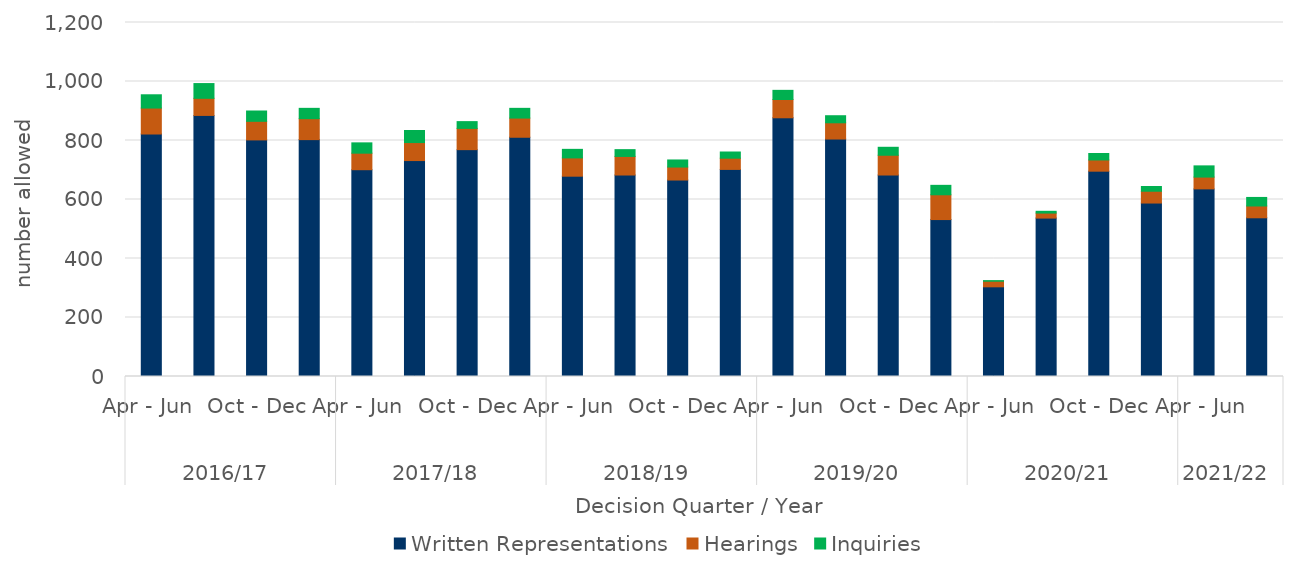
| Category | Written Representations | Hearings | Inquiries |
|---|---|---|---|
| 0 | 822 | 88 | 45 |
| 1 | 885 | 58 | 50 |
| 2 | 802 | 63 | 35 |
| 3 | 803 | 71 | 35 |
| 4 | 701 | 56 | 35 |
| 5 | 732 | 61 | 41 |
| 6 | 769 | 72 | 23 |
| 7 | 811 | 65 | 33 |
| 8 | 679 | 62 | 29 |
| 9 | 683 | 63 | 23 |
| 10 | 666 | 44 | 24 |
| 11 | 702 | 38 | 21 |
| 12 | 877 | 62 | 31 |
| 13 | 805 | 55 | 24 |
| 14 | 683 | 67 | 27 |
| 15 | 532 | 84 | 32 |
| 16 | 304 | 19 | 2 |
| 17 | 537 | 17 | 6 |
| 18 | 696 | 38 | 22 |
| 19 | 588 | 40 | 16 |
| 20 | 636 | 40 | 38 |
| 21 | 538 | 40 | 29 |